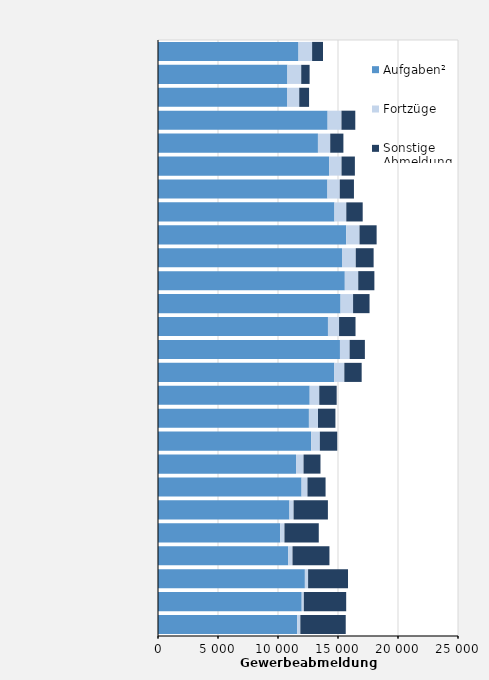
| Category | Aufgaben² | Fortzüge | Sonstige Abmeldungen⁴ |
|---|---|---|---|
| 1997.0 | 11603 | 259 | 3782 |
| 1998.0 | 11976 | 177 | 3529 |
| 1999.0 | 12240 | 268 | 3326 |
| 2000.0 | 10853 | 356 | 3078 |
| 2001.0 | 10187 | 351 | 2860 |
| 2002.0 | 10953 | 348 | 2857 |
| 2003.0 | 11965 | 490 | 1509 |
| 2004.0 | 11504 | 625 | 1411 |
| 2005.0 | 12763 | 724 | 1449 |
| 2006.0 | 12576 | 755 | 1454 |
| 2007.0 | 12642 | 796 | 1452 |
| 2008.0 | 14693 | 834 | 1445 |
| 2009.0 | 15163 | 805 | 1272 |
| 2010.0 | 14163 | 926 | 1371 |
| 2011.0 | 15213 | 1043 | 1373 |
| 2012.0 | 15567 | 1119 | 1346 |
| 2013.0 | 15333 | 1147 | 1488 |
| 2014.0 | 15684 | 1109 | 1426 |
| 2015.0 | 14703 | 988 | 1367 |
| 2016.0 | 14120 | 1028 | 1181 |
| 2017.0 | 14259 | 1036 | 1112 |
| 2018.0 | 13328 | 1024 | 1098 |
| 2019.0 | 14135 | 1155 | 1151 |
| 2020.0 | 10752 | 1017 | 820 |
| 2021.0 | 10784 | 1151 | 699 |
| 2022.0 | 11708 | 1135 | 905 |